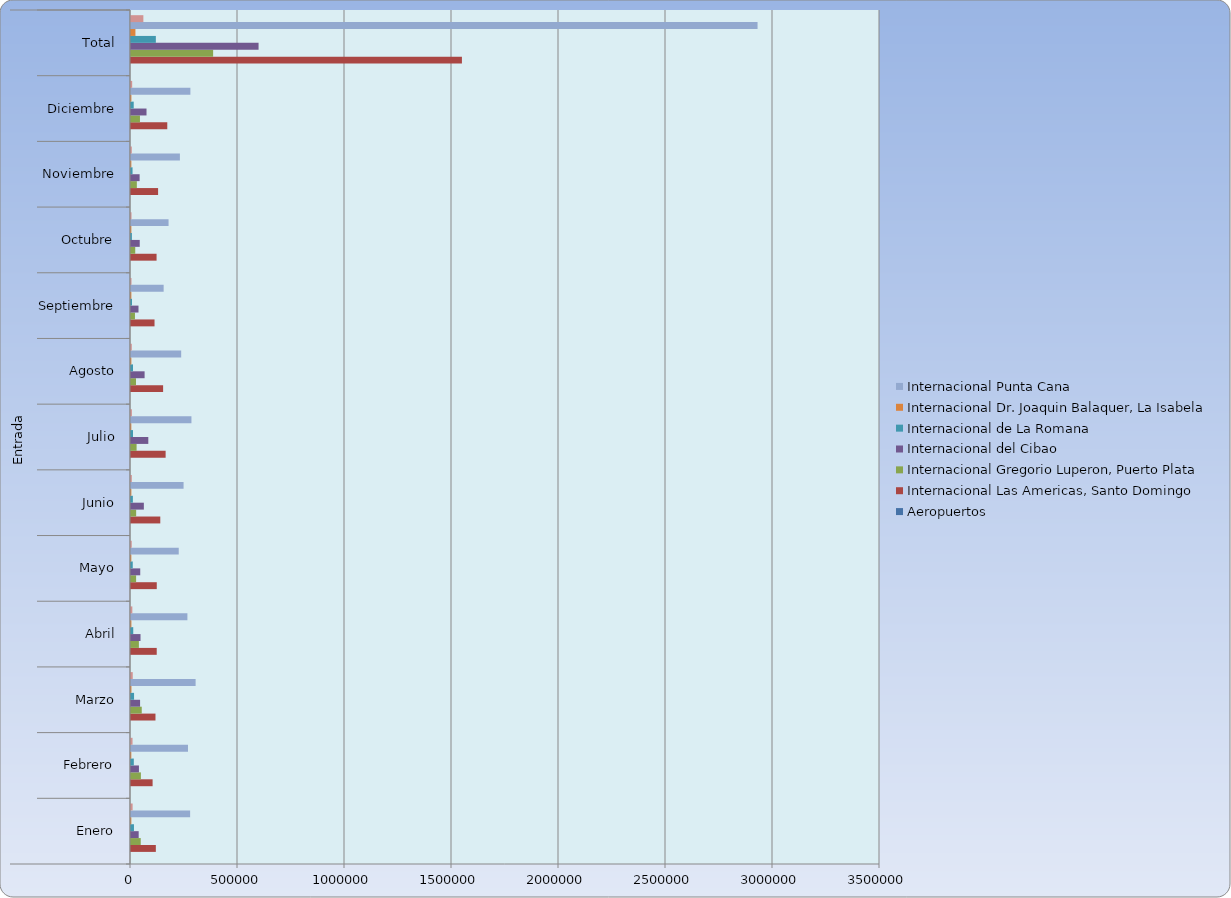
| Category | Aeropuertos | Internacional Las Americas, Santo Domingo | Internacional Gregorio Luperon, Puerto Plata  | Internacional del Cibao | Internacional de La Romana  | Internacional Dr. Joaquin Balaquer, La Isabela | Internacional Punta Cana  | Internacional Profesor Juan Bosch, El Catey (Samana) |
|---|---|---|---|---|---|---|---|---|
| 0 |  | 116055 | 45478 | 35884 | 13851 | 1618 | 276300 | 7538 |
| 1 |  | 100957 | 46227 | 37112 | 13160 | 1473 | 266298 | 7166 |
| 2 |  | 114373 | 50184 | 42448 | 14297 | 2101 | 301944 | 8119 |
| 3 |  | 120230 | 36899 | 44467 | 10470 | 1908 | 263569 | 6282 |
| 4 |  | 120437 | 23882 | 43159 | 8208 | 1611 | 223057 | 3377 |
| 5 |  | 136867 | 24097 | 60049 | 8724 | 1705 | 245643 | 3762 |
| 6 |  | 161797 | 26167 | 80857 | 9315 | 1553 | 282429 | 4095 |
| 7 |  | 150070 | 23333 | 63553 | 9287 | 1735 | 234491 | 3640 |
| 8 |  | 109957 | 18501 | 35035 | 4642 | 1733 | 152549 | 2278 |
| 9 |  | 119503 | 19846 | 40814 | 4216 | 1754 | 175513 | 2333 |
| 10 |  | 126592 | 27317 | 40261 | 7235 | 1683 | 228513 | 3680 |
| 11 |  | 169523 | 41881 | 72491 | 12686 | 1867 | 277521 | 5511 |
| 12 |  | 1546361 | 383812 | 596130 | 116091 | 20741 | 2927827 | 57781 |